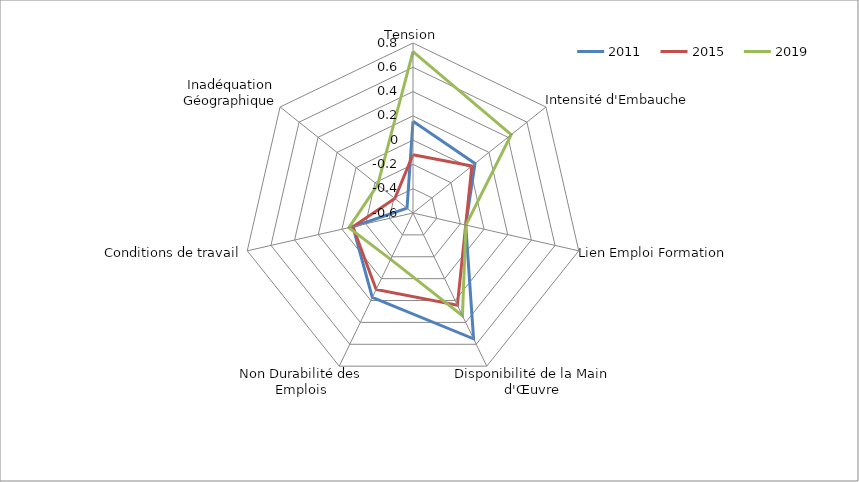
| Category | 2011 | 2015 | 2019 |
|---|---|---|---|
| Tension | 0.155 | -0.12 | 0.728 |
| Intensité d'Embauche | 0.053 | 0.02 | 0.434 |
| Lien Emploi Formation | -0.155 | -0.155 | -0.153 |
| Disponibilité de la Main d'Œuvre | 0.55 | 0.243 | 0.338 |
| Non Durabilité des Emplois | 0.172 | 0.099 | -0.177 |
| Conditions de travail | -0.092 | -0.092 | -0.058 |
| Inadéquation Géographique | -0.537 | -0.408 | -0.228 |